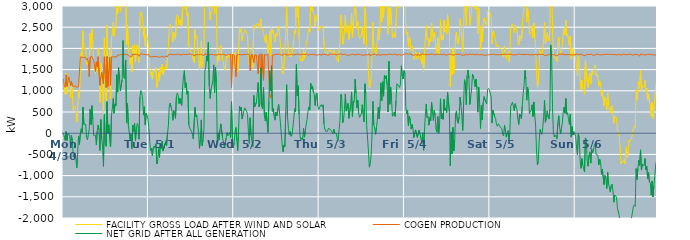
| Category | FACILITY GROSS LOAD AFTER WIND AND SOLAR | COGEN PRODUCTION | NET GRID AFTER ALL GENERATION |
|---|---|---|---|
|  Mon  4/30 | 1276 | 1276 | 0 |
|  Mon  4/30 | 1101 | 1109 | -8 |
|  Mon  4/30 | 907 | 1079 | -172 |
|  Mon  4/30 | 1418 | 1379 | 39 |
|  Mon  4/30 | 933 | 1104 | -171 |
|  Mon  4/30 | 1200 | 1209 | -9 |
|  Mon  4/30 | 1306 | 1328 | -22 |
|  Mon  4/30 | 1191 | 1229 | -38 |
|  Mon  4/30 | 836 | 1124 | -288 |
|  Mon  4/30 | 1167 | 1221 | -54 |
|  Mon  4/30 | 940 | 1113 | -173 |
|  Mon  4/30 | 531 | 1092 | -561 |
|  Mon  4/30 | 599 | 1103 | -504 |
|  Mon  4/30 | 640 | 1103 | -463 |
|  Mon  4/30 | 519 | 1114 | -595 |
|  Mon  4/30 | 262 | 1078 | -816 |
|  Mon  4/30 | 638 | 1092 | -454 |
|  Mon  4/30 | 1023 | 1096 | -73 |
|  Mon  4/30 | 835 | 1098 | -263 |
|  Mon  4/30 | 1791 | 1799 | -8 |
|  Mon  4/30 | 1915 | 1810 | 105 |
|  Mon  4/30 | 1810 | 1794 | 16 |
|  Mon  4/30 | 2415 | 1801 | 614 |
|  Mon  4/30 | 1991 | 1785 | 206 |
|  Mon  4/30 | 2008 | 1803 | 205 |
|  Mon  4/30 | 2004 | 1793 | 211 |
|  Mon  4/30 | 1625 | 1724 | -99 |
|  Mon  4/30 | 1610 | 1765 | -155 |
|  Mon  4/30 | 1639 | 1675 | -36 |
|  Mon  4/30 | 1434 | 1335 | 99 |
|  Mon  4/30 | 2364 | 1799 | 565 |
|  Mon  4/30 | 2014 | 1813 | 201 |
|  Mon  4/30 | 2459 | 1809 | 650 |
|  Mon  4/30 | 2142 | 1813 | 329 |
|  Mon  4/30 | 1657 | 1708 | -51 |
|  Mon  4/30 | 1650 | 1724 | -74 |
|  Mon  4/30 | 1411 | 1457 | -46 |
|  Mon  4/30 | 1410 | 1683 | -273 |
|  Mon  4/30 | 1619 | 1566 | 53 |
|  Mon  4/30 | 1997 | 1806 | 191 |
|  Mon  4/30 | 1878 | 1803 | 75 |
|  Mon  4/30 | 723 | 1128 | -405 |
|  Mon  4/30 | 1643 | 1321 | 322 |
|  Mon  4/30 | 1309 | 1438 | -129 |
|  Mon  4/30 | 981 | 1287 | -306 |
|  Mon  4/30 | 381 | 1163 | -782 |
|  Mon  4/30 | 2245 | 1803 | 442 |
|  Mon  4/30 | 1162 | 1400 | -238 |
|  Mon  4/30 | 762 | 1072 | -310 |
|  Mon  4/30 | 2551 | 1808 | 743 |
|  Mon  4/30 | 1096 | 1100 | -4 |
|  Mon  4/30 | 1672 | 1474 | 198 |
|  Mon  4/30 | 1978 | 1791 | 187 |
|  Mon  4/30 | 805 | 1129 | -324 |
|  Mon  4/30 | 2220 | 1801 | 419 |
|  Mon  4/30 | 2380 | 1799 | 581 |
|  Mon  4/30 | 2617 | 1801 | 816 |
|  Mon  4/30 | 2286 | 1816 | 470 |
|  Mon  4/30 | 2492 | 1800 | 692 |
|  Mon  4/30 | 2457 | 1810 | 647 |
|  Mon  4/30 | 3176 | 1797 | 1379 |
|  Mon  4/30 | 2816 | 1847 | 969 |
|  Mon  4/30 | 3401 | 1855 | 1546 |
|  Mon  4/30 | 3145 | 1843 | 1302 |
|  Mon  4/30 | 2858 | 1860 | 998 |
|  Mon  4/30 | 2838 | 1857 | 981 |
|  Mon  4/30 | 3123 | 1860 | 1263 |
|  Mon  4/30 | 4035 | 1850 | 2185 |
|  Mon  4/30 | 3178 | 1860 | 1318 |
|  Mon  4/30 | 3146 | 1863 | 1283 |
|  Mon  4/30 | 3588 | 1859 | 1729 |
|  Mon  4/30 | 2096 | 1857 | 239 |
|  Mon  4/30 | 2556 | 1858 | 698 |
|  Mon  4/30 | 2037 | 1848 | 189 |
|  Mon  4/30 | 2019 | 1846 | 173 |
|  Mon  4/30 | 1622 | 1797 | -175 |
|  Mon  4/30 | 1801 | 1815 | -14 |
|  Mon  4/30 | 1447 | 1808 | -361 |
|  Mon  4/30 | 2061 | 1867 | 194 |
|  Mon  4/30 | 1891 | 1854 | 37 |
|  Mon  4/30 | 2090 | 1859 | 231 |
|  Mon  4/30 | 1676 | 1849 | -173 |
|  Mon  4/30 | 1954 | 1856 | 98 |
|  Mon  4/30 | 2087 | 1862 | 225 |
|  Mon  4/30 | 2022 | 1849 | 173 |
|  Mon  4/30 | 1669 | 1812 | -143 |
|  Mon  4/30 | 2706 | 1858 | 848 |
|  Mon  4/30 | 2862 | 1858 | 1004 |
|  Mon  4/30 | 2828 | 1871 | 957 |
|  Mon  4/30 | 2664 | 1860 | 804 |
|  Mon  4/30 | 2287 | 1861 | 426 |
|  Mon  4/30 | 2487 | 1864 | 623 |
|  Mon  4/30 | 2051 | 1857 | 194 |
|  Mon  4/30 | 2319 | 1844 | 475 |
|  Mon  4/30 | 2269 | 1847 | 422 |
|  Mon  4/30 | 2183 | 1843 | 340 |
|  Tue  5/1 | 1990 | 1860 | 130 |
|  Tue  5/1 | 1605 | 1802 | -197 |
|  Tue  5/1 | 1374 | 1789 | -415 |
|  Tue  5/1 | 1452 | 1803 | -351 |
|  Tue  5/1 | 1278 | 1805 | -527 |
|  Tue  5/1 | 1455 | 1804 | -349 |
|  Tue  5/1 | 1490 | 1789 | -299 |
|  Tue  5/1 | 1457 | 1809 | -352 |
|  Tue  5/1 | 1541 | 1791 | -250 |
|  Tue  5/1 | 1083 | 1809 | -726 |
|  Tue  5/1 | 1175 | 1802 | -627 |
|  Tue  5/1 | 1428 | 1791 | -363 |
|  Tue  5/1 | 1228 | 1797 | -569 |
|  Tue  5/1 | 1550 | 1795 | -245 |
|  Tue  5/1 | 1441 | 1810 | -369 |
|  Tue  5/1 | 1625 | 1814 | -189 |
|  Tue  5/1 | 1380 | 1803 | -423 |
|  Tue  5/1 | 1387 | 1791 | -404 |
|  Tue  5/1 | 1554 | 1808 | -254 |
|  Tue  5/1 | 1585 | 1815 | -230 |
|  Tue  5/1 | 1516 | 1812 | -296 |
|  Tue  5/1 | 1793 | 1802 | -9 |
|  Tue  5/1 | 2023 | 1850 | 173 |
|  Tue  5/1 | 2507 | 1870 | 637 |
|  Tue  5/1 | 2566 | 1856 | 710 |
|  Tue  5/1 | 2473 | 1858 | 615 |
|  Tue  5/1 | 2411 | 1871 | 540 |
|  Tue  5/1 | 2150 | 1845 | 305 |
|  Tue  5/1 | 2386 | 1852 | 534 |
|  Tue  5/1 | 2301 | 1854 | 447 |
|  Tue  5/1 | 2214 | 1864 | 350 |
|  Tue  5/1 | 2705 | 1853 | 852 |
|  Tue  5/1 | 2799 | 1854 | 945 |
|  Tue  5/1 | 2760 | 1871 | 889 |
|  Tue  5/1 | 2552 | 1855 | 697 |
|  Tue  5/1 | 2676 | 1854 | 822 |
|  Tue  5/1 | 2565 | 1860 | 705 |
|  Tue  5/1 | 2501 | 1844 | 657 |
|  Tue  5/1 | 2912 | 1844 | 1068 |
|  Tue  5/1 | 3215 | 1870 | 1345 |
|  Tue  5/1 | 3334 | 1858 | 1476 |
|  Tue  5/1 | 2930 | 1853 | 1077 |
|  Tue  5/1 | 3043 | 1855 | 1188 |
|  Tue  5/1 | 2776 | 1859 | 917 |
|  Tue  5/1 | 2828 | 1836 | 992 |
|  Tue  5/1 | 2060 | 1864 | 196 |
|  Tue  5/1 | 1982 | 1861 | 121 |
|  Tue  5/1 | 1974 | 1866 | 108 |
|  Tue  5/1 | 1888 | 1844 | 44 |
|  Tue  5/1 | 1839 | 1856 | -17 |
|  Tue  5/1 | 1720 | 1856 | -136 |
|  Tue  5/1 | 1662 | 1821 | -159 |
|  Tue  5/1 | 2458 | 1849 | 609 |
|  Tue  5/1 | 2246 | 1864 | 382 |
|  Tue  5/1 | 2280 | 1853 | 427 |
|  Tue  5/1 | 2054 | 1862 | 192 |
|  Tue  5/1 | 1870 | 1850 | 20 |
|  Tue  5/1 | 1484 | 1840 | -356 |
|  Tue  5/1 | 1713 | 1860 | -147 |
|  Tue  5/1 | 2174 | 1860 | 314 |
|  Tue  5/1 | 1552 | 1847 | -295 |
|  Tue  5/1 | 1697 | 1857 | -160 |
|  Tue  5/1 | 1919 | 1832 | 87 |
|  Tue  5/1 | 3343 | 1871 | 1472 |
|  Tue  5/1 | 3406 | 1859 | 1547 |
|  Tue  5/1 | 3682 | 1860 | 1822 |
|  Tue  5/1 | 3559 | 1859 | 1700 |
|  Tue  5/1 | 3997 | 1850 | 2147 |
|  Tue  5/1 | 2974 | 1866 | 1108 |
|  Tue  5/1 | 2674 | 1853 | 821 |
|  Tue  5/1 | 2868 | 1835 | 1033 |
|  Tue  5/1 | 2908 | 1860 | 1048 |
|  Tue  5/1 | 3086 | 1854 | 1232 |
|  Tue  5/1 | 3459 | 1848 | 1611 |
|  Tue  5/1 | 2820 | 1861 | 959 |
|  Tue  5/1 | 3400 | 1848 | 1552 |
|  Tue  5/1 | 3035 | 1855 | 1180 |
|  Tue  5/1 | 1610 | 1840 | -230 |
|  Tue  5/1 | 1877 | 1868 | 9 |
|  Tue  5/1 | 1713 | 1872 | -159 |
|  Tue  5/1 | 1935 | 1859 | 76 |
|  Tue  5/1 | 2068 | 1847 | 221 |
|  Tue  5/1 | 2066 | 1846 | 220 |
|  Tue  5/1 | 1724 | 1848 | -124 |
|  Tue  5/1 | 1655 | 1869 | -214 |
|  Tue  5/1 | 1501 | 1847 | -346 |
|  Tue  5/1 | 1477 | 1837 | -360 |
|  Tue  5/1 | 1740 | 1852 | -112 |
|  Tue  5/1 | 1858 | 1843 | 15 |
|  Tue  5/1 | 1790 | 1847 | -57 |
|  Tue  5/1 | 1838 | 1861 | -23 |
|  Tue  5/1 | 1883 | 1862 | 21 |
|  Tue  5/1 | 1755 | 1862 | -107 |
|  Tue  5/1 | 1810 | 1067 | 743 |
|  Tue  5/1 | 1813 | 1857 | -44 |
|  Tue  5/1 | 1521 | 1866 | -345 |
|  Wed  5/2 | 1619 | 1845 | -226 |
|  Wed  5/2 | 1912 | 1864 | 48 |
|  Wed  5/2 | 1463 | 1330 | 133 |
|  Wed  5/2 | 1672 | 1847 | -175 |
|  Wed  5/2 | 1448 | 1857 | -409 |
|  Wed  5/2 | 1968 | 1854 | 114 |
|  Wed  5/2 | 2493 | 1855 | 638 |
|  Wed  5/2 | 2378 | 1854 | 524 |
|  Wed  5/2 | 2465 | 1850 | 615 |
|  Wed  5/2 | 2182 | 1846 | 336 |
|  Wed  5/2 | 2294 | 1855 | 439 |
|  Wed  5/2 | 2386 | 1859 | 527 |
|  Wed  5/2 | 2444 | 1848 | 596 |
|  Wed  5/2 | 2444 | 1853 | 591 |
|  Wed  5/2 | 2362 | 1844 | 518 |
|  Wed  5/2 | 2308 | 1866 | 442 |
|  Wed  5/2 | 1892 | 1860 | 32 |
|  Wed  5/2 | 1621 | 1862 | -241 |
|  Wed  5/2 | 1834 | 1470 | 364 |
|  Wed  5/2 | 1784 | 1831 | -47 |
|  Wed  5/2 | 1682 | 1870 | -188 |
|  Wed  5/2 | 1551 | 1866 | -315 |
|  Wed  5/2 | 2556 | 1664 | 892 |
|  Wed  5/2 | 2467 | 1847 | 620 |
|  Wed  5/2 | 2483 | 1865 | 618 |
|  Wed  5/2 | 2568 | 1842 | 726 |
|  Wed  5/2 | 2583 | 1835 | 748 |
|  Wed  5/2 | 2597 | 1402 | 1195 |
|  Wed  5/2 | 2470 | 1848 | 622 |
|  Wed  5/2 | 2567 | 1873 | 694 |
|  Wed  5/2 | 2696 | 1158 | 1538 |
|  Wed  5/2 | 2512 | 1871 | 641 |
|  Wed  5/2 | 2427 | 1849 | 578 |
|  Wed  5/2 | 2330 | 1247 | 1083 |
|  Wed  5/2 | 2262 | 1851 | 411 |
|  Wed  5/2 | 2134 | 1843 | 291 |
|  Wed  5/2 | 2330 | 1841 | 489 |
|  Wed  5/2 | 2129 | 1864 | 265 |
|  Wed  5/2 | 1885 | 1867 | 18 |
|  Wed  5/2 | 2090 | 1338 | 752 |
|  Wed  5/2 | 2414 | 943 | 1471 |
|  Wed  5/2 | 1833 | 832 | 1001 |
|  Wed  5/2 | 2488 | 900 | 1588 |
|  Wed  5/2 | 2359 | 1843 | 516 |
|  Wed  5/2 | 2440 | 1855 | 585 |
|  Wed  5/2 | 2256 | 1853 | 403 |
|  Wed  5/2 | 2161 | 1854 | 307 |
|  Wed  5/2 | 2355 | 1860 | 495 |
|  Wed  5/2 | 2285 | 1880 | 405 |
|  Wed  5/2 | 2441 | 1864 | 577 |
|  Wed  5/2 | 2523 | 1845 | 678 |
|  Wed  5/2 | 2338 | 1863 | 475 |
|  Wed  5/2 | 2110 | 1861 | 249 |
|  Wed  5/2 | 1834 | 1847 | -13 |
|  Wed  5/2 | 1559 | 1835 | -276 |
|  Wed  5/2 | 1400 | 1838 | -438 |
|  Wed  5/2 | 1564 | 1840 | -276 |
|  Wed  5/2 | 1562 | 1882 | -320 |
|  Wed  5/2 | 2347 | 1852 | 495 |
|  Wed  5/2 | 2988 | 1842 | 1146 |
|  Wed  5/2 | 2243 | 1846 | 397 |
|  Wed  5/2 | 1946 | 1839 | 107 |
|  Wed  5/2 | 1807 | 1844 | -37 |
|  Wed  5/2 | 1883 | 1848 | 35 |
|  Wed  5/2 | 1796 | 1867 | -71 |
|  Wed  5/2 | 1803 | 1846 | -43 |
|  Wed  5/2 | 1984 | 1845 | 139 |
|  Wed  5/2 | 2187 | 1861 | 326 |
|  Wed  5/2 | 2429 | 1847 | 582 |
|  Wed  5/2 | 2360 | 1854 | 506 |
|  Wed  5/2 | 3487 | 1866 | 1621 |
|  Wed  5/2 | 2735 | 1858 | 877 |
|  Wed  5/2 | 2985 | 1865 | 1120 |
|  Wed  5/2 | 2301 | 1864 | 437 |
|  Wed  5/2 | 1791 | 1847 | -56 |
|  Wed  5/2 | 1701 | 1854 | -153 |
|  Wed  5/2 | 1749 | 1860 | -111 |
|  Wed  5/2 | 1699 | 1848 | -149 |
|  Wed  5/2 | 1979 | 1861 | 118 |
|  Wed  5/2 | 1749 | 1843 | -94 |
|  Wed  5/2 | 1896 | 1851 | 45 |
|  Wed  5/2 | 2092 | 1876 | 216 |
|  Wed  5/2 | 2182 | 1855 | 327 |
|  Wed  5/2 | 2348 | 1842 | 506 |
|  Wed  5/2 | 2472 | 1853 | 619 |
|  Wed  5/2 | 2397 | 1852 | 545 |
|  Wed  5/2 | 3035 | 1856 | 1179 |
|  Wed  5/2 | 2897 | 1855 | 1042 |
|  Wed  5/2 | 2964 | 1850 | 1114 |
|  Wed  5/2 | 2839 | 1864 | 975 |
|  Wed  5/2 | 2783 | 1857 | 926 |
|  Wed  5/2 | 2502 | 1849 | 653 |
|  Wed  5/2 | 2749 | 1855 | 894 |
|  Wed  5/2 | 2783 | 1837 | 946 |
|  Wed  5/2 | 2504 | 1856 | 648 |
|  Wed  5/2 | 2412 | 1853 | 559 |
|  Thu  5/3 | 2431 | 1849 | 582 |
|  Thu  5/3 | 2506 | 1860 | 646 |
|  Thu  5/3 | 2503 | 1831 | 672 |
|  Thu  5/3 | 2491 | 1867 | 624 |
|  Thu  5/3 | 2532 | 1863 | 669 |
|  Thu  5/3 | 2075 | 1856 | 219 |
|  Thu  5/3 | 1945 | 1856 | 89 |
|  Thu  5/3 | 1901 | 1856 | 45 |
|  Thu  5/3 | 1900 | 1866 | 34 |
|  Thu  5/3 | 1885 | 1838 | 47 |
|  Thu  5/3 | 1961 | 1847 | 114 |
|  Thu  5/3 | 1953 | 1850 | 103 |
|  Thu  5/3 | 1927 | 1835 | 92 |
|  Thu  5/3 | 1970 | 1871 | 99 |
|  Thu  5/3 | 1879 | 1848 | 31 |
|  Thu  5/3 | 1836 | 1856 | -20 |
|  Thu  5/3 | 1964 | 1866 | 98 |
|  Thu  5/3 | 1875 | 1869 | 6 |
|  Thu  5/3 | 1837 | 1843 | -6 |
|  Thu  5/3 | 1836 | 1848 | -12 |
|  Thu  5/3 | 1722 | 1851 | -129 |
|  Thu  5/3 | 1675 | 1848 | -173 |
|  Thu  5/3 | 1949 | 1865 | 84 |
|  Thu  5/3 | 2151 | 1857 | 294 |
|  Thu  5/3 | 2789 | 1868 | 921 |
|  Thu  5/3 | 2669 | 1849 | 820 |
|  Thu  5/3 | 2096 | 1850 | 246 |
|  Thu  5/3 | 2171 | 1848 | 323 |
|  Thu  5/3 | 2421 | 1866 | 555 |
|  Thu  5/3 | 2788 | 1865 | 923 |
|  Thu  5/3 | 2362 | 1842 | 520 |
|  Thu  5/3 | 2358 | 1850 | 508 |
|  Thu  5/3 | 2544 | 1846 | 698 |
|  Thu  5/3 | 2209 | 1859 | 350 |
|  Thu  5/3 | 2202 | 1831 | 371 |
|  Thu  5/3 | 2530 | 1857 | 673 |
|  Thu  5/3 | 2827 | 1853 | 974 |
|  Thu  5/3 | 2259 | 1863 | 396 |
|  Thu  5/3 | 2597 | 1841 | 756 |
|  Thu  5/3 | 2585 | 1853 | 732 |
|  Thu  5/3 | 3121 | 1851 | 1270 |
|  Thu  5/3 | 2777 | 1839 | 938 |
|  Thu  5/3 | 2469 | 1872 | 597 |
|  Thu  5/3 | 2628 | 1852 | 776 |
|  Thu  5/3 | 2330 | 1857 | 473 |
|  Thu  5/3 | 2226 | 1854 | 372 |
|  Thu  5/3 | 2227 | 1854 | 373 |
|  Thu  5/3 | 2319 | 1869 | 450 |
|  Thu  5/3 | 2508 | 1836 | 672 |
|  Thu  5/3 | 2303 | 1838 | 465 |
|  Thu  5/3 | 2108 | 1842 | 266 |
|  Thu  5/3 | 3007 | 1842 | 1165 |
|  Thu  5/3 | 2774 | 1853 | 921 |
|  Thu  5/3 | 2040 | 1863 | 177 |
|  Thu  5/3 | 2016 | 1847 | 169 |
|  Thu  5/3 | 1443 | 1854 | -411 |
|  Thu  5/3 | 1069 | 1870 | -801 |
|  Thu  5/3 | 1112 | 1823 | -711 |
|  Thu  5/3 | 1321 | 1844 | -523 |
|  Thu  5/3 | 1779 | 1849 | -70 |
|  Thu  5/3 | 2620 | 1868 | 752 |
|  Thu  5/3 | 2050 | 1860 | 190 |
|  Thu  5/3 | 1981 | 1860 | 121 |
|  Thu  5/3 | 1842 | 1868 | -26 |
|  Thu  5/3 | 1968 | 1835 | 133 |
|  Thu  5/3 | 2161 | 1852 | 309 |
|  Thu  5/3 | 2468 | 1858 | 610 |
|  Thu  5/3 | 2197 | 1860 | 337 |
|  Thu  5/3 | 2479 | 1838 | 641 |
|  Thu  5/3 | 3029 | 1842 | 1187 |
|  Thu  5/3 | 2619 | 1851 | 768 |
|  Thu  5/3 | 3055 | 1838 | 1217 |
|  Thu  5/3 | 2726 | 1853 | 873 |
|  Thu  5/3 | 3219 | 1857 | 1362 |
|  Thu  5/3 | 3139 | 1852 | 1287 |
|  Thu  5/3 | 3212 | 1857 | 1355 |
|  Thu  5/3 | 2985 | 1849 | 1136 |
|  Thu  5/3 | 2336 | 1834 | 502 |
|  Thu  5/3 | 3562 | 1868 | 1694 |
|  Thu  5/3 | 2547 | 1864 | 683 |
|  Thu  5/3 | 2944 | 1860 | 1084 |
|  Thu  5/3 | 2623 | 1850 | 773 |
|  Thu  5/3 | 2249 | 1850 | 399 |
|  Thu  5/3 | 2281 | 1858 | 423 |
|  Thu  5/3 | 2368 | 1870 | 498 |
|  Thu  5/3 | 2259 | 1861 | 398 |
|  Thu  5/3 | 2616 | 1848 | 768 |
|  Thu  5/3 | 3027 | 1861 | 1166 |
|  Thu  5/3 | 2991 | 1848 | 1143 |
|  Thu  5/3 | 2957 | 1843 | 1114 |
|  Thu  5/3 | 2937 | 1859 | 1078 |
|  Thu  5/3 | 3014 | 1851 | 1163 |
|  Thu  5/3 | 3424 | 1835 | 1589 |
|  Thu  5/3 | 3199 | 1846 | 1353 |
|  Thu  5/3 | 3135 | 1854 | 1281 |
|  Thu  5/3 | 3340 | 1865 | 1475 |
|  Fri  5/4 | 3282 | 1867 | 1415 |
|  Fri  5/4 | 2478 | 1847 | 631 |
|  Fri  5/4 | 2329 | 1872 | 457 |
|  Fri  5/4 | 2384 | 1849 | 535 |
|  Fri  5/4 | 2036 | 1864 | 172 |
|  Fri  5/4 | 2256 | 1857 | 399 |
|  Fri  5/4 | 2194 | 1873 | 321 |
|  Fri  5/4 | 1950 | 1853 | 97 |
|  Fri  5/4 | 2052 | 1848 | 204 |
|  Fri  5/4 | 1968 | 1852 | 116 |
|  Fri  5/4 | 1731 | 1837 | -106 |
|  Fri  5/4 | 1759 | 1848 | -89 |
|  Fri  5/4 | 1933 | 1855 | 78 |
|  Fri  5/4 | 1953 | 1864 | 89 |
|  Fri  5/4 | 1736 | 1834 | -98 |
|  Fri  5/4 | 1783 | 1865 | -82 |
|  Fri  5/4 | 1905 | 1834 | 71 |
|  Fri  5/4 | 1843 | 1851 | -8 |
|  Fri  5/4 | 1712 | 1852 | -140 |
|  Fri  5/4 | 1640 | 1857 | -217 |
|  Fri  5/4 | 1882 | 1872 | 10 |
|  Fri  5/4 | 1455 | 1856 | -401 |
|  Fri  5/4 | 1894 | 1853 | 41 |
|  Fri  5/4 | 2282 | 1852 | 430 |
|  Fri  5/4 | 2537 | 1854 | 683 |
|  Fri  5/4 | 2208 | 1843 | 365 |
|  Fri  5/4 | 2250 | 1851 | 399 |
|  Fri  5/4 | 2041 | 1852 | 189 |
|  Fri  5/4 | 2225 | 1856 | 369 |
|  Fri  5/4 | 2156 | 1862 | 294 |
|  Fri  5/4 | 2596 | 1871 | 725 |
|  Fri  5/4 | 2367 | 1849 | 518 |
|  Fri  5/4 | 2159 | 1859 | 300 |
|  Fri  5/4 | 2382 | 1848 | 534 |
|  Fri  5/4 | 2279 | 1844 | 435 |
|  Fri  5/4 | 1954 | 1866 | 88 |
|  Fri  5/4 | 1891 | 1868 | 23 |
|  Fri  5/4 | 2249 | 1857 | 392 |
|  Fri  5/4 | 1852 | 1854 | -2 |
|  Fri  5/4 | 2067 | 1843 | 224 |
|  Fri  5/4 | 2675 | 1862 | 813 |
|  Fri  5/4 | 2193 | 1851 | 342 |
|  Fri  5/4 | 2309 | 1848 | 461 |
|  Fri  5/4 | 2196 | 1869 | 327 |
|  Fri  5/4 | 2665 | 1867 | 798 |
|  Fri  5/4 | 2388 | 1851 | 537 |
|  Fri  5/4 | 2430 | 1841 | 589 |
|  Fri  5/4 | 2334 | 1851 | 483 |
|  Fri  5/4 | 2805 | 1843 | 962 |
|  Fri  5/4 | 2819 | 1869 | 950 |
|  Fri  5/4 | 2369 | 1860 | 509 |
|  Fri  5/4 | 1092 | 1858 | -766 |
|  Fri  5/4 | 1874 | 1844 | 30 |
|  Fri  5/4 | 1367 | 1850 | -483 |
|  Fri  5/4 | 1993 | 1857 | 136 |
|  Fri  5/4 | 1422 | 1842 | -420 |
|  Fri  5/4 | 1684 | 1854 | -170 |
|  Fri  5/4 | 2312 | 1860 | 452 |
|  Fri  5/4 | 2388 | 1862 | 526 |
|  Fri  5/4 | 2151 | 1863 | 288 |
|  Fri  5/4 | 2094 | 1860 | 234 |
|  Fri  5/4 | 2258 | 1866 | 392 |
|  Fri  5/4 | 2699 | 1846 | 853 |
|  Fri  5/4 | 2528 | 1862 | 666 |
|  Fri  5/4 | 2239 | 1834 | 405 |
|  Fri  5/4 | 1919 | 1855 | 64 |
|  Fri  5/4 | 2545 | 1844 | 701 |
|  Fri  5/4 | 3124 | 1862 | 1262 |
|  Fri  5/4 | 2999 | 1840 | 1159 |
|  Fri  5/4 | 2542 | 1867 | 675 |
|  Fri  5/4 | 3205 | 1846 | 1359 |
|  Fri  5/4 | 3337 | 1845 | 1492 |
|  Fri  5/4 | 3153 | 1856 | 1297 |
|  Fri  5/4 | 2545 | 1867 | 678 |
|  Fri  5/4 | 2718 | 1855 | 863 |
|  Fri  5/4 | 2903 | 1855 | 1048 |
|  Fri  5/4 | 3251 | 1860 | 1391 |
|  Fri  5/4 | 3192 | 1863 | 1329 |
|  Fri  5/4 | 3105 | 1852 | 1253 |
|  Fri  5/4 | 2934 | 1837 | 1097 |
|  Fri  5/4 | 3142 | 1869 | 1273 |
|  Fri  5/4 | 2920 | 1868 | 1052 |
|  Fri  5/4 | 2344 | 1849 | 495 |
|  Fri  5/4 | 2951 | 1868 | 1083 |
|  Fri  5/4 | 2555 | 1850 | 705 |
|  Fri  5/4 | 1959 | 1847 | 112 |
|  Fri  5/4 | 2514 | 1853 | 661 |
|  Fri  5/4 | 2152 | 1839 | 313 |
|  Fri  5/4 | 2566 | 1846 | 720 |
|  Fri  5/4 | 2726 | 1863 | 863 |
|  Fri  5/4 | 2715 | 1834 | 881 |
|  Fri  5/4 | 2577 | 1849 | 728 |
|  Fri  5/4 | 2542 | 1848 | 694 |
|  Fri  5/4 | 2882 | 1853 | 1029 |
|  Fri  5/4 | 2905 | 1849 | 1056 |
|  Fri  5/4 | 2891 | 1865 | 1026 |
|  Sat  5/5 | 2894 | 1854 | 1040 |
|  Sat  5/5 | 2721 | 1864 | 857 |
|  Sat  5/5 | 2101 | 1860 | 241 |
|  Sat  5/5 | 2388 | 1844 | 544 |
|  Sat  5/5 | 2426 | 1869 | 557 |
|  Sat  5/5 | 2253 | 1866 | 387 |
|  Sat  5/5 | 2192 | 1847 | 345 |
|  Sat  5/5 | 2063 | 1855 | 208 |
|  Sat  5/5 | 2021 | 1855 | 166 |
|  Sat  5/5 | 2075 | 1853 | 222 |
|  Sat  5/5 | 2052 | 1844 | 208 |
|  Sat  5/5 | 2007 | 1856 | 151 |
|  Sat  5/5 | 2023 | 1857 | 166 |
|  Sat  5/5 | 1959 | 1853 | 106 |
|  Sat  5/5 | 1827 | 1855 | -28 |
|  Sat  5/5 | 1793 | 1859 | -66 |
|  Sat  5/5 | 2056 | 1867 | 189 |
|  Sat  5/5 | 1898 | 1852 | 46 |
|  Sat  5/5 | 1761 | 1855 | -94 |
|  Sat  5/5 | 1876 | 1872 | 4 |
|  Sat  5/5 | 1927 | 1868 | 59 |
|  Sat  5/5 | 1679 | 1859 | -180 |
|  Sat  5/5 | 1869 | 1856 | 13 |
|  Sat  5/5 | 2495 | 1860 | 635 |
|  Sat  5/5 | 2504 | 1863 | 641 |
|  Sat  5/5 | 2582 | 1852 | 730 |
|  Sat  5/5 | 2584 | 1842 | 742 |
|  Sat  5/5 | 2379 | 1848 | 531 |
|  Sat  5/5 | 2544 | 1848 | 696 |
|  Sat  5/5 | 2472 | 1861 | 611 |
|  Sat  5/5 | 2413 | 1849 | 564 |
|  Sat  5/5 | 2173 | 1844 | 329 |
|  Sat  5/5 | 2079 | 1873 | 206 |
|  Sat  5/5 | 2310 | 1856 | 454 |
|  Sat  5/5 | 2264 | 1859 | 405 |
|  Sat  5/5 | 2177 | 1840 | 337 |
|  Sat  5/5 | 2498 | 1853 | 645 |
|  Sat  5/5 | 2800 | 1858 | 942 |
|  Sat  5/5 | 2980 | 1854 | 1126 |
|  Sat  5/5 | 3337 | 1855 | 1482 |
|  Sat  5/5 | 3133 | 1861 | 1272 |
|  Sat  5/5 | 2625 | 1847 | 778 |
|  Sat  5/5 | 2937 | 1856 | 1081 |
|  Sat  5/5 | 2817 | 1860 | 957 |
|  Sat  5/5 | 2314 | 1850 | 464 |
|  Sat  5/5 | 2315 | 1850 | 465 |
|  Sat  5/5 | 2392 | 1849 | 543 |
|  Sat  5/5 | 2533 | 1862 | 671 |
|  Sat  5/5 | 2248 | 1852 | 396 |
|  Sat  5/5 | 2601 | 1865 | 736 |
|  Sat  5/5 | 2272 | 1852 | 420 |
|  Sat  5/5 | 2034 | 1840 | 194 |
|  Sat  5/5 | 1471 | 1865 | -394 |
|  Sat  5/5 | 1086 | 1834 | -748 |
|  Sat  5/5 | 1198 | 1864 | -666 |
|  Sat  5/5 | 1684 | 1844 | -160 |
|  Sat  5/5 | 1948 | 1858 | 90 |
|  Sat  5/5 | 1862 | 1846 | 16 |
|  Sat  5/5 | 1829 | 1859 | -30 |
|  Sat  5/5 | 1997 | 1861 | 136 |
|  Sat  5/5 | 2230 | 1853 | 377 |
|  Sat  5/5 | 2606 | 1827 | 779 |
|  Sat  5/5 | 2105 | 1847 | 258 |
|  Sat  5/5 | 2191 | 1841 | 350 |
|  Sat  5/5 | 2369 | 1842 | 527 |
|  Sat  5/5 | 2223 | 1843 | 380 |
|  Sat  5/5 | 2173 | 1841 | 332 |
|  Sat  5/5 | 2431 | 1868 | 563 |
|  Sat  5/5 | 3948 | 1865 | 2083 |
|  Sat  5/5 | 3647 | 1864 | 1783 |
|  Sat  5/5 | 2453 | 1841 | 612 |
|  Sat  5/5 | 1862 | 1848 | 14 |
|  Sat  5/5 | 1777 | 1868 | -91 |
|  Sat  5/5 | 1802 | 1845 | -43 |
|  Sat  5/5 | 1812 | 1835 | -23 |
|  Sat  5/5 | 1689 | 1820 | -131 |
|  Sat  5/5 | 2096 | 1849 | 247 |
|  Sat  5/5 | 2268 | 1856 | 412 |
|  Sat  5/5 | 2001 | 1864 | 137 |
|  Sat  5/5 | 1847 | 1864 | -17 |
|  Sat  5/5 | 1983 | 1869 | 114 |
|  Sat  5/5 | 2081 | 1848 | 233 |
|  Sat  5/5 | 2347 | 1864 | 483 |
|  Sat  5/5 | 2468 | 1854 | 614 |
|  Sat  5/5 | 2317 | 1847 | 470 |
|  Sat  5/5 | 2667 | 1850 | 817 |
|  Sat  5/5 | 2299 | 1853 | 446 |
|  Sat  5/5 | 2331 | 1849 | 482 |
|  Sat  5/5 | 2181 | 1856 | 325 |
|  Sat  5/5 | 2062 | 1855 | 207 |
|  Sat  5/5 | 2293 | 1849 | 444 |
|  Sat  5/5 | 1743 | 1836 | -93 |
|  Sat  5/5 | 1999 | 1841 | 158 |
|  Sat  5/5 | 1817 | 1861 | -44 |
|  Sat  5/5 | 1891 | 1853 | 38 |
|  Sat  5/5 | 1881 | 1845 | 36 |
|  Sun  5/6 | 1772 | 1846 | -74 |
|  Sun  5/6 | 1553 | 1876 | -323 |
|  Sun  5/6 | 1354 | 1859 | -505 |
|  Sun  5/6 | 1826 | 1846 | -20 |
|  Sun  5/6 | 1733 | 1840 | -107 |
|  Sun  5/6 | 1243 | 1867 | -624 |
|  Sun  5/6 | 1023 | 1852 | -829 |
|  Sun  5/6 | 1250 | 1851 | -601 |
|  Sun  5/6 | 1092 | 1841 | -749 |
|  Sun  5/6 | 1110 | 1836 | -726 |
|  Sun  5/6 | 923 | 1839 | -916 |
|  Sun  5/6 | 1715 | 1827 | -112 |
|  Sun  5/6 | 1694 | 1860 | -166 |
|  Sun  5/6 | 1215 | 1855 | -640 |
|  Sun  5/6 | 1075 | 1853 | -778 |
|  Sun  5/6 | 1319 | 1836 | -517 |
|  Sun  5/6 | 1419 | 1858 | -439 |
|  Sun  5/6 | 1164 | 1870 | -706 |
|  Sun  5/6 | 1492 | 1864 | -372 |
|  Sun  5/6 | 1375 | 1840 | -465 |
|  Sun  5/6 | 1429 | 1844 | -415 |
|  Sun  5/6 | 1544 | 1833 | -289 |
|  Sun  5/6 | 1601 | 1849 | -248 |
|  Sun  5/6 | 1360 | 1862 | -502 |
|  Sun  5/6 | 1388 | 1868 | -480 |
|  Sun  5/6 | 1348 | 1864 | -516 |
|  Sun  5/6 | 1105 | 1855 | -750 |
|  Sun  5/6 | 1236 | 1848 | -612 |
|  Sun  5/6 | 1202 | 1862 | -660 |
|  Sun  5/6 | 876 | 1845 | -969 |
|  Sun  5/6 | 1002 | 1850 | -848 |
|  Sun  5/6 | 1008 | 1854 | -846 |
|  Sun  5/6 | 650 | 1861 | -1211 |
|  Sun  5/6 | 858 | 1855 | -997 |
|  Sun  5/6 | 791 | 1857 | -1066 |
|  Sun  5/6 | 558 | 1862 | -1304 |
|  Sun  5/6 | 953 | 1868 | -915 |
|  Sun  5/6 | 667 | 1858 | -1191 |
|  Sun  5/6 | 651 | 1857 | -1206 |
|  Sun  5/6 | 473 | 1861 | -1388 |
|  Sun  5/6 | 613 | 1850 | -1237 |
|  Sun  5/6 | 656 | 1854 | -1198 |
|  Sun  5/6 | 488 | 1842 | -1354 |
|  Sun  5/6 | 231 | 1858 | -1627 |
|  Sun  5/6 | 405 | 1861 | -1456 |
|  Sun  5/6 | 386 | 1849 | -1463 |
|  Sun  5/6 | 350 | 1857 | -1507 |
|  Sun  5/6 | 80 | 1848 | -1768 |
|  Sun  5/6 | 60 | 1847 | -1787 |
|  Sun  5/6 | -75 | 1866 | -1941 |
|  Sun  5/6 | -325 | 1841 | -2166 |
|  Sun  5/6 | -728 | 1842 | -2570 |
|  Sun  5/6 | -658 | 1848 | -2506 |
|  Sun  5/6 | -685 | 1828 | -2513 |
|  Sun  5/6 | -636 | 1863 | -2499 |
|  Sun  5/6 | -722 | 1850 | -2572 |
|  Sun  5/6 | -577 | 1851 | -2428 |
|  Sun  5/6 | -333 | 1849 | -2182 |
|  Sun  5/6 | -584 | 1853 | -2437 |
|  Sun  5/6 | -433 | 1856 | -2289 |
|  Sun  5/6 | -162 | 1862 | -2024 |
|  Sun  5/6 | -196 | 1845 | -2041 |
|  Sun  5/6 | -203 | 1863 | -2066 |
|  Sun  5/6 | -113 | 1860 | -1973 |
|  Sun  5/6 | -128 | 1841 | -1969 |
|  Sun  5/6 | 130 | 1858 | -1728 |
|  Sun  5/6 | 158 | 1851 | -1693 |
|  Sun  5/6 | 125 | 1851 | -1726 |
|  Sun  5/6 | 1026 | 1860 | -834 |
|  Sun  5/6 | 778 | 1874 | -1096 |
|  Sun  5/6 | 1022 | 1853 | -831 |
|  Sun  5/6 | 1225 | 1862 | -637 |
|  Sun  5/6 | 1057 | 1818 | -761 |
|  Sun  5/6 | 1474 | 1866 | -392 |
|  Sun  5/6 | 976 | 1846 | -870 |
|  Sun  5/6 | 1132 | 1861 | -729 |
|  Sun  5/6 | 1111 | 1846 | -735 |
|  Sun  5/6 | 1076 | 1843 | -767 |
|  Sun  5/6 | 1253 | 1852 | -599 |
|  Sun  5/6 | 983 | 1850 | -867 |
|  Sun  5/6 | 1067 | 1852 | -785 |
|  Sun  5/6 | 779 | 1857 | -1078 |
|  Sun  5/6 | 915 | 1842 | -927 |
|  Sun  5/6 | 719 | 1866 | -1147 |
|  Sun  5/6 | 681 | 1863 | -1182 |
|  Sun  5/6 | 393 | 1854 | -1461 |
|  Sun  5/6 | 726 | 1853 | -1127 |
|  Sun  5/6 | 348 | 1850 | -1502 |
|  Sun  5/6 | 617 | 1851 | -1234 |
|  Sun  5/6 | 815 | 1837 | -1022 |
|  Sun  5/6 | 1072 | 1824 | -752 |
|  Sun  5/6 | 1211 | 1854 | -643 |